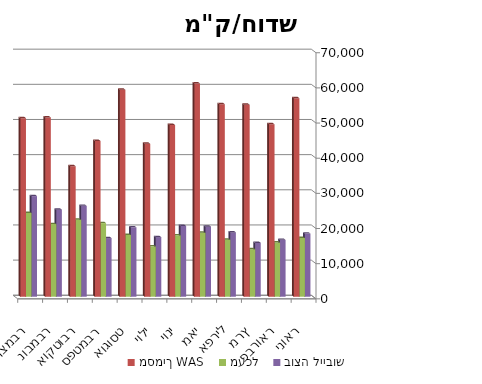
| Category | מסמיך WAS | מעכל | בוצה לייבוש |
|---|---|---|---|
| ינואר | 56466 | 16698 | 17957 |
| פברואר | 49053 | 15421 | 16174 |
| מרץ | 54620 | 13507 | 15310 |
| אפריל | 54771 | 16215 | 18300 |
| מאי | 60673 | 18184 | 19927 |
| יוני | 48841 | 17455 | 20113 |
| יולי | 43503 | 14327 | 16943 |
| אוגוסט | 58878 | 17550 | 19739 |
| ספטמבר | 44302 | 20933 | 16656 |
| אוקטובר | 37119 | 21891 | 25845 |
| נובמבר | 50989 | 20665 | 24758 |
| דצמבר | 50794 | 23812 | 28621 |